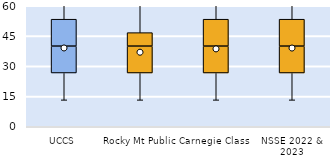
| Category | 25th | 50th | 75th |
|---|---|---|---|
| UCCS | 26.667 | 13.333 | 13.333 |
| Rocky Mt Public | 26.667 | 13.333 | 6.667 |
| Carnegie Class | 26.667 | 13.333 | 13.333 |
| NSSE 2022 & 2023 | 26.667 | 13.333 | 13.333 |